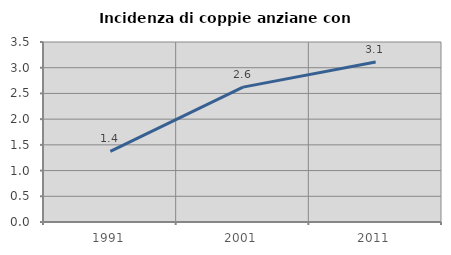
| Category | Incidenza di coppie anziane con figli |
|---|---|
| 1991.0 | 1.374 |
| 2001.0 | 2.623 |
| 2011.0 | 3.111 |